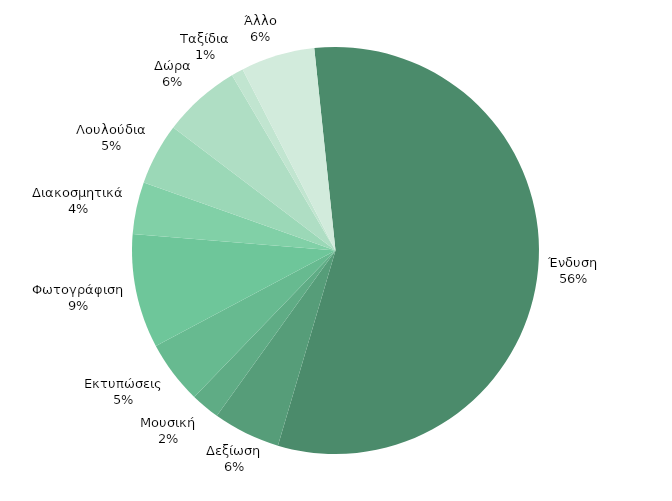
| Category | ΠΡΑΓΜΑΤΙΚΑ |
|---|---|
| Ένδυση | 9770 |
| Δεξίωση | 928 |
| Μουσική | 400 |
| Εκτυπώσεις | 870 |
| Φωτογράφιση | 1575 |
| Διακοσμητικά | 720 |
| Λουλούδια | 850 |
| Δώρα | 1075 |
| Ταξίδια | 165 |
| Άλλο | 1021 |